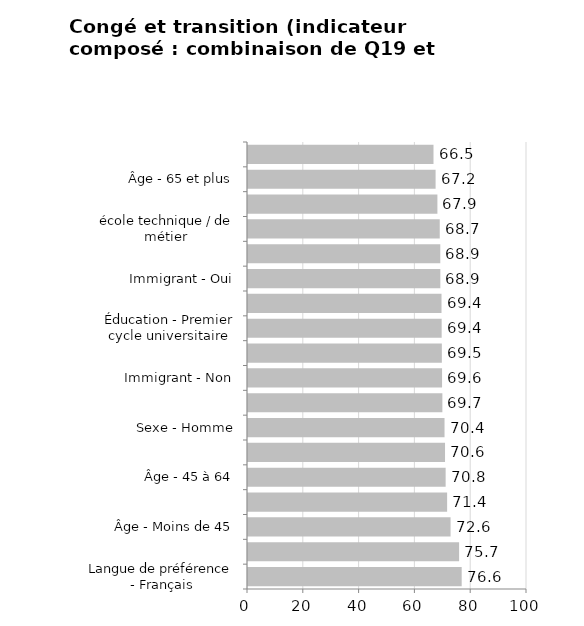
| Category | Total |
|---|---|
| Langue de préférence - Français | 76.588 |
| Autochtone - Oui | 75.664 |
| Âge - Moins de 45 | 72.604 |
| Éducation - Secondaire (partiel) | 71.37 |
| Âge - 45 à 64 | 70.838 |
| Éducation - 8e année ou moins | 70.618 |
| Sexe - Homme | 70.439 |
| Éducation - Secondaire ou test d'équivalence | 69.665 |
| Immigrant - Non | 69.553 |
| Nouveau-Brunswick | 69.48 |
| Éducation - Premier cycle universitaire | 69.412 |
| Autochtone - Non | 69.363 |
| Immigrant - Oui | 68.94 |
| Éducation - Collège, école technique / de métier | 68.921 |
| Sexe - Femme | 68.729 |
| Âge - 65 et plus | 67.888 |
| Langue de préférence - Anglais | 67.24 |
| Éducation - Maîtrise ou doctorat | 66.49 |